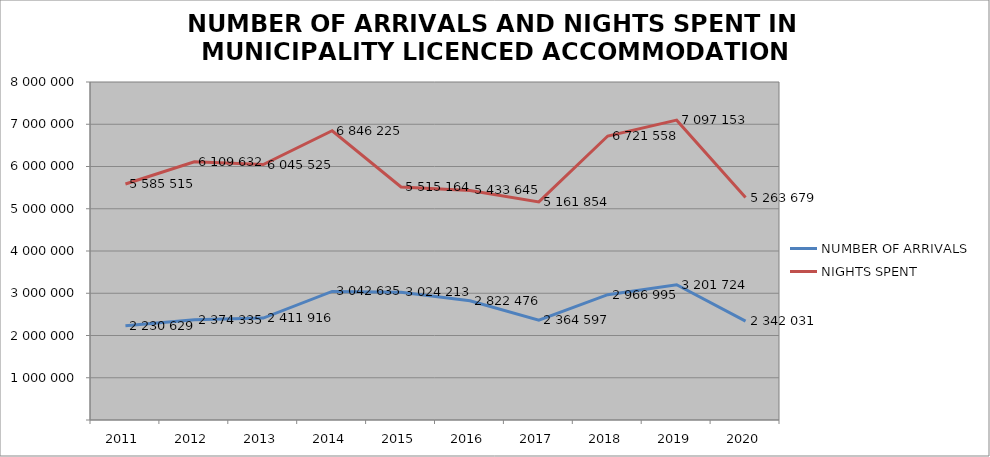
| Category | NUMBER OF ARRIVALS | NIGHTS SPENT |
|---|---|---|
| 2011 | 2230629 | 5585515 |
| 2012 | 2374335 | 6109632 |
| 2013 | 2411916 | 6045525 |
| 2014 | 3042635 | 6846225 |
| 2015 | 3024213 | 5515164 |
| 2016 | 2822476 | 5433645 |
| 2017 | 2364597 | 5161854 |
| 2018 | 2966995 | 6721558 |
| 2019 | 3201724 | 7097153 |
| 2020 | 2342031 | 5263679 |